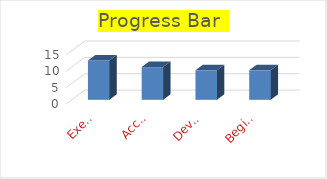
| Category | Series 0 |
|---|---|
| Exemplary | 12 |
| Accompalished  | 10 |
| Developing  | 9 |
| Beginning  | 9 |